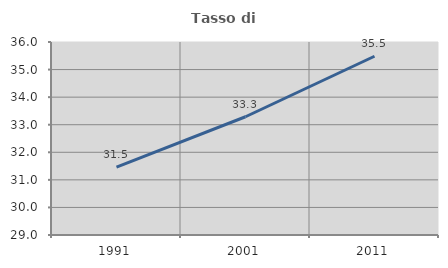
| Category | Tasso di occupazione   |
|---|---|
| 1991.0 | 31.462 |
| 2001.0 | 33.289 |
| 2011.0 | 35.484 |